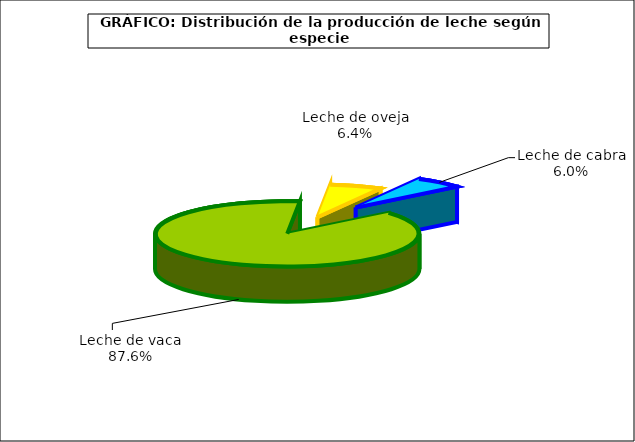
| Category | Series 0 |
|---|---|
| Leche de vaca | 7401.056 |
| Leche de oveja | 539.791 |
| Leche de cabra | 503.584 |